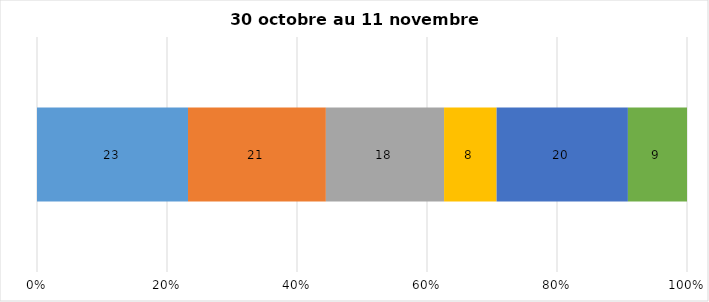
| Category | Plusieurs fois par jour | Une fois par jour | Quelques fois par semaine   | Une fois par semaine ou moins   |  Jamais   |  Je n’utilise pas les médias sociaux |
|---|---|---|---|---|---|---|
| 0 | 23 | 21 | 18 | 8 | 20 | 9 |